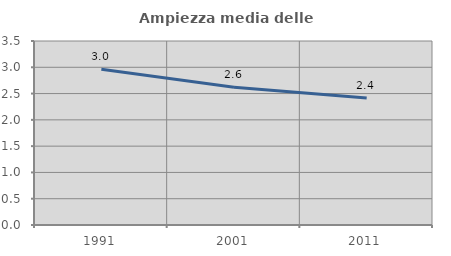
| Category | Ampiezza media delle famiglie |
|---|---|
| 1991.0 | 2.962 |
| 2001.0 | 2.62 |
| 2011.0 | 2.414 |